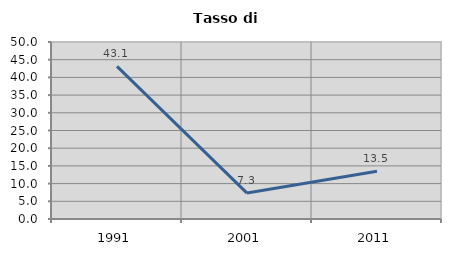
| Category | Tasso di disoccupazione   |
|---|---|
| 1991.0 | 43.132 |
| 2001.0 | 7.33 |
| 2011.0 | 13.487 |